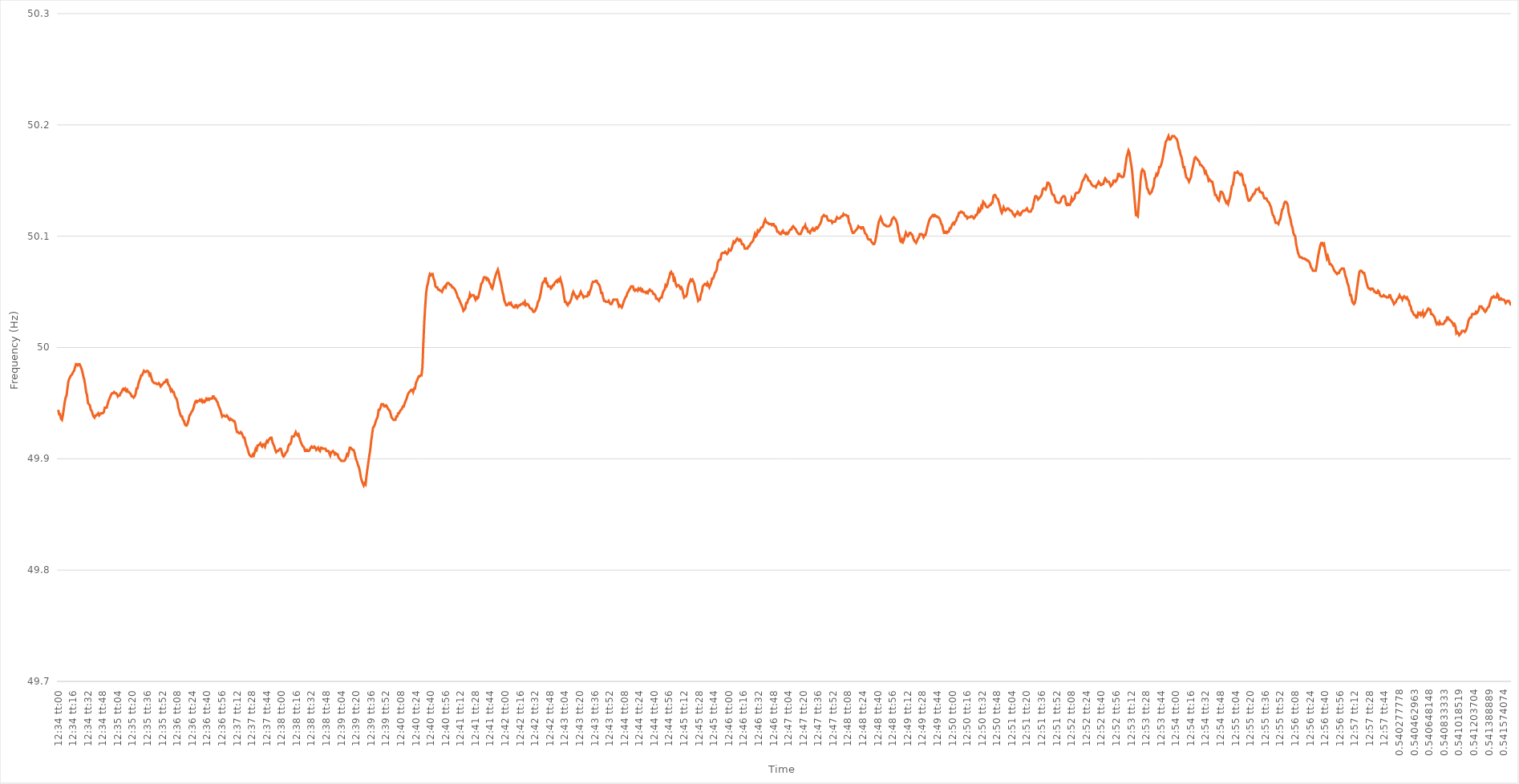
| Category | Series 0 |
|---|---|
| 0.5236111111111111 | 49.944 |
| 0.5236226851851852 | 49.94 |
| 0.5236342592592592 | 49.94 |
| 0.5236458333333334 | 49.936 |
| 0.5236574074074074 | 49.935 |
| 0.5236689814814816 | 49.939 |
| 0.5236805555555556 | 49.945 |
| 0.5236921296296296 | 49.951 |
| 0.5237037037037037 | 49.955 |
| 0.5237152777777777 | 49.957 |
| 0.5237268518518519 | 49.964 |
| 0.5237384259259259 | 49.97 |
| 0.52375 | 49.972 |
| 0.5237615740740741 | 49.974 |
| 0.5237731481481481 | 49.975 |
| 0.5237847222222222 | 49.976 |
| 0.5237962962962963 | 49.978 |
| 0.5238078703703704 | 49.979 |
| 0.5238194444444445 | 49.982 |
| 0.5238310185185185 | 49.985 |
| 0.5238425925925926 | 49.985 |
| 0.5238541666666666 | 49.984 |
| 0.5238657407407408 | 49.985 |
| 0.5238773148148148 | 49.985 |
| 0.523888888888889 | 49.983 |
| 0.523900462962963 | 49.981 |
| 0.523912037037037 | 49.978 |
| 0.5239236111111111 | 49.974 |
| 0.5239351851851851 | 49.971 |
| 0.5239467592592593 | 49.966 |
| 0.5239583333333333 | 49.96 |
| 0.5239699074074075 | 49.957 |
| 0.5239814814814815 | 49.95 |
| 0.5239930555555555 | 49.949 |
| 0.5240046296296296 | 49.948 |
| 0.5240162037037037 | 49.944 |
| 0.5240277777777778 | 49.943 |
| 0.5240393518518519 | 49.94 |
| 0.524050925925926 | 49.938 |
| 0.5240625 | 49.937 |
| 0.524074074074074 | 49.939 |
| 0.5240856481481482 | 49.939 |
| 0.5240972222222222 | 49.94 |
| 0.5241087962962964 | 49.941 |
| 0.5241203703703704 | 49.939 |
| 0.5241319444444444 | 49.94 |
| 0.5241435185185185 | 49.941 |
| 0.5241550925925925 | 49.941 |
| 0.5241666666666667 | 49.941 |
| 0.5241782407407407 | 49.942 |
| 0.5241898148148149 | 49.946 |
| 0.5242013888888889 | 49.946 |
| 0.5242129629629629 | 49.946 |
| 0.524224537037037 | 49.949 |
| 0.5242361111111111 | 49.952 |
| 0.5242476851851852 | 49.954 |
| 0.5242592592592593 | 49.956 |
| 0.5242708333333334 | 49.958 |
| 0.5242824074074074 | 49.959 |
| 0.5242939814814814 | 49.959 |
| 0.5243055555555556 | 49.96 |
| 0.5243171296296296 | 49.959 |
| 0.5243287037037038 | 49.959 |
| 0.5243402777777778 | 49.958 |
| 0.5243518518518518 | 49.956 |
| 0.5243634259259259 | 49.957 |
| 0.524375 | 49.957 |
| 0.5243865740740741 | 49.959 |
| 0.5243981481481481 | 49.96 |
| 0.5244097222222223 | 49.962 |
| 0.5244212962962963 | 49.963 |
| 0.5244328703703703 | 49.962 |
| 0.5244444444444444 | 49.963 |
| 0.5244560185185185 | 49.961 |
| 0.5244675925925926 | 49.962 |
| 0.5244791666666667 | 49.96 |
| 0.5244907407407408 | 49.96 |
| 0.5245023148148148 | 49.959 |
| 0.5245138888888888 | 49.958 |
| 0.524525462962963 | 49.956 |
| 0.524537037037037 | 49.956 |
| 0.5245486111111112 | 49.955 |
| 0.5245601851851852 | 49.956 |
| 0.5245717592592593 | 49.958 |
| 0.5245833333333333 | 49.963 |
| 0.5245949074074074 | 49.963 |
| 0.5246064814814815 | 49.967 |
| 0.5246180555555556 | 49.97 |
| 0.5246296296296297 | 49.972 |
| 0.5246412037037037 | 49.975 |
| 0.5246527777777777 | 49.975 |
| 0.5246643518518518 | 49.977 |
| 0.5246759259259259 | 49.979 |
| 0.5246875 | 49.978 |
| 0.5246990740740741 | 49.978 |
| 0.5247106481481482 | 49.979 |
| 0.5247222222222222 | 49.979 |
| 0.5247337962962962 | 49.978 |
| 0.5247453703703704 | 49.975 |
| 0.5247569444444444 | 49.976 |
| 0.5247685185185186 | 49.973 |
| 0.5247800925925926 | 49.97 |
| 0.5247916666666667 | 49.969 |
| 0.5248032407407407 | 49.968 |
| 0.5248148148148148 | 49.968 |
| 0.5248263888888889 | 49.968 |
| 0.524837962962963 | 49.967 |
| 0.5248495370370371 | 49.967 |
| 0.5248611111111111 | 49.968 |
| 0.5248726851851852 | 49.967 |
| 0.5248842592592592 | 49.965 |
| 0.5248958333333333 | 49.966 |
| 0.5249074074074074 | 49.967 |
| 0.5249189814814815 | 49.968 |
| 0.5249305555555556 | 49.969 |
| 0.5249421296296296 | 49.969 |
| 0.5249537037037036 | 49.971 |
| 0.5249652777777778 | 49.971 |
| 0.5249768518518518 | 49.967 |
| 0.524988425925926 | 49.966 |
| 0.525 | 49.964 |
| 0.5250115740740741 | 49.961 |
| 0.5250231481481481 | 49.962 |
| 0.5250347222222222 | 49.96 |
| 0.5250462962962963 | 49.96 |
| 0.5250578703703704 | 49.957 |
| 0.5250694444444445 | 49.955 |
| 0.5250810185185185 | 49.954 |
| 0.5250925925925926 | 49.951 |
| 0.5251041666666666 | 49.946 |
| 0.5251157407407407 | 49.943 |
| 0.5251273148148148 | 49.94 |
| 0.5251388888888889 | 49.938 |
| 0.525150462962963 | 49.938 |
| 0.525162037037037 | 49.935 |
| 0.525173611111111 | 49.934 |
| 0.5251851851851852 | 49.931 |
| 0.5251967592592592 | 49.93 |
| 0.5252083333333334 | 49.93 |
| 0.5252199074074074 | 49.932 |
| 0.5252314814814815 | 49.935 |
| 0.5252430555555555 | 49.939 |
| 0.5252546296296297 | 49.94 |
| 0.5252662037037037 | 49.942 |
| 0.5252777777777778 | 49.943 |
| 0.5252893518518519 | 49.945 |
| 0.5253009259259259 | 49.948 |
| 0.5253125 | 49.951 |
| 0.5253240740740741 | 49.952 |
| 0.5253356481481481 | 49.951 |
| 0.5253472222222222 | 49.952 |
| 0.5253587962962963 | 49.952 |
| 0.5253703703703704 | 49.953 |
| 0.5253819444444444 | 49.952 |
| 0.5253935185185185 | 49.953 |
| 0.5254050925925926 | 49.951 |
| 0.5254166666666666 | 49.952 |
| 0.5254282407407408 | 49.951 |
| 0.5254398148148148 | 49.952 |
| 0.5254513888888889 | 49.954 |
| 0.5254629629629629 | 49.953 |
| 0.5254745370370371 | 49.954 |
| 0.5254861111111111 | 49.953 |
| 0.5254976851851852 | 49.954 |
| 0.5255092592592593 | 49.954 |
| 0.5255208333333333 | 49.954 |
| 0.5255324074074074 | 49.956 |
| 0.5255439814814815 | 49.956 |
| 0.5255555555555556 | 49.954 |
| 0.5255671296296297 | 49.954 |
| 0.5255787037037037 | 49.952 |
| 0.5255902777777778 | 49.951 |
| 0.5256018518518518 | 49.948 |
| 0.5256134259259259 | 49.946 |
| 0.525625 | 49.944 |
| 0.525636574074074 | 49.941 |
| 0.5256481481481482 | 49.938 |
| 0.5256597222222222 | 49.939 |
| 0.5256712962962963 | 49.939 |
| 0.5256828703703703 | 49.938 |
| 0.5256944444444445 | 49.938 |
| 0.5257060185185185 | 49.939 |
| 0.5257175925925927 | 49.938 |
| 0.5257291666666667 | 49.936 |
| 0.5257407407407407 | 49.935 |
| 0.5257523148148148 | 49.936 |
| 0.5257638888888889 | 49.935 |
| 0.525775462962963 | 49.935 |
| 0.5257870370370371 | 49.934 |
| 0.5257986111111111 | 49.934 |
| 0.5258101851851852 | 49.932 |
| 0.5258217592592592 | 49.927 |
| 0.5258333333333333 | 49.924 |
| 0.5258449074074074 | 49.924 |
| 0.5258564814814815 | 49.923 |
| 0.5258680555555556 | 49.923 |
| 0.5258796296296296 | 49.924 |
| 0.5258912037037037 | 49.923 |
| 0.5259027777777777 | 49.921 |
| 0.5259143518518519 | 49.919 |
| 0.5259259259259259 | 49.919 |
| 0.5259375000000001 | 49.915 |
| 0.5259490740740741 | 49.912 |
| 0.5259606481481481 | 49.91 |
| 0.5259722222222222 | 49.907 |
| 0.5259837962962963 | 49.904 |
| 0.5259953703703704 | 49.903 |
| 0.5260069444444445 | 49.902 |
| 0.5260185185185186 | 49.902 |
| 0.5260300925925926 | 49.904 |
| 0.5260416666666666 | 49.903 |
| 0.5260532407407407 | 49.906 |
| 0.5260648148148148 | 49.909 |
| 0.5260763888888889 | 49.908 |
| 0.526087962962963 | 49.912 |
| 0.526099537037037 | 49.912 |
| 0.5261111111111111 | 49.913 |
| 0.5261226851851851 | 49.914 |
| 0.5261342592592593 | 49.912 |
| 0.5261458333333333 | 49.911 |
| 0.5261574074074075 | 49.913 |
| 0.5261689814814815 | 49.913 |
| 0.5261805555555555 | 49.911 |
| 0.5261921296296296 | 49.914 |
| 0.5262037037037037 | 49.916 |
| 0.5262152777777778 | 49.915 |
| 0.5262268518518519 | 49.917 |
| 0.526238425925926 | 49.918 |
| 0.52625 | 49.919 |
| 0.526261574074074 | 49.919 |
| 0.5262731481481482 | 49.915 |
| 0.5262847222222222 | 49.913 |
| 0.5262962962962963 | 49.911 |
| 0.5263078703703704 | 49.908 |
| 0.5263194444444445 | 49.906 |
| 0.5263310185185185 | 49.907 |
| 0.5263425925925925 | 49.907 |
| 0.5263541666666667 | 49.908 |
| 0.5263657407407407 | 49.909 |
| 0.5263773148148149 | 49.909 |
| 0.5263888888888889 | 49.906 |
| 0.526400462962963 | 49.903 |
| 0.526412037037037 | 49.902 |
| 0.5264236111111111 | 49.903 |
| 0.5264351851851852 | 49.905 |
| 0.5264467592592593 | 49.906 |
| 0.5264583333333334 | 49.907 |
| 0.5264699074074074 | 49.911 |
| 0.5264814814814814 | 49.913 |
| 0.5264930555555556 | 49.913 |
| 0.5265046296296296 | 49.915 |
| 0.5265162037037037 | 49.92 |
| 0.5265277777777778 | 49.92 |
| 0.5265393518518519 | 49.92 |
| 0.5265509259259259 | 49.922 |
| 0.5265624999999999 | 49.924 |
| 0.5265740740740741 | 49.922 |
| 0.5265856481481481 | 49.921 |
| 0.5265972222222223 | 49.922 |
| 0.5266087962962963 | 49.919 |
| 0.5266203703703703 | 49.916 |
| 0.5266319444444444 | 49.914 |
| 0.5266435185185185 | 49.912 |
| 0.5266550925925926 | 49.911 |
| 0.5266666666666667 | 49.91 |
| 0.5266782407407408 | 49.907 |
| 0.5266898148148148 | 49.907 |
| 0.5267013888888888 | 49.908 |
| 0.526712962962963 | 49.907 |
| 0.526724537037037 | 49.907 |
| 0.5267361111111112 | 49.908 |
| 0.5267476851851852 | 49.91 |
| 0.5267592592592593 | 49.911 |
| 0.5267708333333333 | 49.91 |
| 0.5267824074074073 | 49.91 |
| 0.5267939814814815 | 49.911 |
| 0.5268055555555555 | 49.91 |
| 0.5268171296296297 | 49.908 |
| 0.5268287037037037 | 49.909 |
| 0.5268402777777778 | 49.91 |
| 0.5268518518518518 | 49.908 |
| 0.5268634259259259 | 49.907 |
| 0.526875 | 49.91 |
| 0.5268865740740741 | 49.91 |
| 0.5268981481481482 | 49.909 |
| 0.5269097222222222 | 49.909 |
| 0.5269212962962962 | 49.909 |
| 0.5269328703703704 | 49.909 |
| 0.5269444444444444 | 49.907 |
| 0.5269560185185186 | 49.907 |
| 0.5269675925925926 | 49.907 |
| 0.5269791666666667 | 49.905 |
| 0.5269907407407407 | 49.903 |
| 0.5270023148148147 | 49.906 |
| 0.5270138888888889 | 49.906 |
| 0.5270254629629629 | 49.907 |
| 0.5270370370370371 | 49.906 |
| 0.5270486111111111 | 49.904 |
| 0.5270601851851852 | 49.905 |
| 0.5270717592592592 | 49.904 |
| 0.5270833333333333 | 49.904 |
| 0.5270949074074074 | 49.901 |
| 0.5271064814814815 | 49.9 |
| 0.5271180555555556 | 49.899 |
| 0.5271296296296296 | 49.898 |
| 0.5271412037037037 | 49.898 |
| 0.5271527777777778 | 49.898 |
| 0.5271643518518518 | 49.898 |
| 0.527175925925926 | 49.899 |
| 0.5271875 | 49.901 |
| 0.5271990740740741 | 49.904 |
| 0.5272106481481481 | 49.903 |
| 0.5272222222222223 | 49.906 |
| 0.5272337962962963 | 49.91 |
| 0.5272453703703703 | 49.91 |
| 0.5272569444444445 | 49.909 |
| 0.5272685185185185 | 49.908 |
| 0.5272800925925926 | 49.908 |
| 0.5272916666666666 | 49.906 |
| 0.5273032407407408 | 49.902 |
| 0.5273148148148148 | 49.899 |
| 0.5273263888888889 | 49.897 |
| 0.527337962962963 | 49.894 |
| 0.527349537037037 | 49.892 |
| 0.5273611111111111 | 49.888 |
| 0.5273726851851852 | 49.883 |
| 0.5273842592592592 | 49.88 |
| 0.5273958333333334 | 49.878 |
| 0.5274074074074074 | 49.876 |
| 0.5274189814814815 | 49.878 |
| 0.5274305555555555 | 49.877 |
| 0.5274421296296297 | 49.885 |
| 0.5274537037037037 | 49.891 |
| 0.5274652777777777 | 49.897 |
| 0.5274768518518519 | 49.903 |
| 0.5274884259259259 | 49.908 |
| 0.5275 | 49.916 |
| 0.527511574074074 | 49.922 |
| 0.5275231481481482 | 49.928 |
| 0.5275347222222222 | 49.929 |
| 0.5275462962962963 | 49.931 |
| 0.5275578703703704 | 49.934 |
| 0.5275694444444444 | 49.936 |
| 0.5275810185185185 | 49.938 |
| 0.5275925925925926 | 49.944 |
| 0.5276041666666667 | 49.944 |
| 0.5276157407407408 | 49.946 |
| 0.5276273148148148 | 49.949 |
| 0.5276388888888889 | 49.949 |
| 0.5276504629629629 | 49.949 |
| 0.5276620370370371 | 49.947 |
| 0.5276736111111111 | 49.947 |
| 0.5276851851851853 | 49.948 |
| 0.5276967592592593 | 49.947 |
| 0.5277083333333333 | 49.945 |
| 0.5277199074074074 | 49.944 |
| 0.5277314814814814 | 49.943 |
| 0.5277430555555556 | 49.94 |
| 0.5277546296296296 | 49.937 |
| 0.5277662037037038 | 49.936 |
| 0.5277777777777778 | 49.935 |
| 0.5277893518518518 | 49.935 |
| 0.5278009259259259 | 49.935 |
| 0.5278125 | 49.938 |
| 0.5278240740740741 | 49.938 |
| 0.5278356481481482 | 49.941 |
| 0.5278472222222222 | 49.941 |
| 0.5278587962962963 | 49.943 |
| 0.5278703703703703 | 49.944 |
| 0.5278819444444445 | 49.945 |
| 0.5278935185185185 | 49.947 |
| 0.5279050925925927 | 49.947 |
| 0.5279166666666667 | 49.95 |
| 0.5279282407407407 | 49.952 |
| 0.5279398148148148 | 49.954 |
| 0.5279513888888888 | 49.957 |
| 0.527962962962963 | 49.959 |
| 0.527974537037037 | 49.96 |
| 0.5279861111111112 | 49.961 |
| 0.5279976851851852 | 49.962 |
| 0.5280092592592592 | 49.962 |
| 0.5280208333333333 | 49.96 |
| 0.5280324074074074 | 49.963 |
| 0.5280439814814815 | 49.963 |
| 0.5280555555555556 | 49.968 |
| 0.5280671296296297 | 49.97 |
| 0.5280787037037037 | 49.972 |
| 0.5280902777777777 | 49.974 |
| 0.5281018518518519 | 49.974 |
| 0.5281134259259259 | 49.975 |
| 0.5281250000000001 | 49.975 |
| 0.5281365740740741 | 49.982 |
| 0.5281481481481481 | 50.004 |
| 0.5281597222222222 | 50.023 |
| 0.5281712962962963 | 50.037 |
| 0.5281828703703704 | 50.049 |
| 0.5281944444444444 | 50.055 |
| 0.5282060185185186 | 50.058 |
| 0.5282175925925926 | 50.063 |
| 0.5282291666666666 | 50.066 |
| 0.5282407407407407 | 50.065 |
| 0.5282523148148148 | 50.066 |
| 0.5282638888888889 | 50.066 |
| 0.528275462962963 | 50.062 |
| 0.528287037037037 | 50.06 |
| 0.5282986111111111 | 50.055 |
| 0.5283101851851851 | 50.054 |
| 0.5283217592592593 | 50.054 |
| 0.5283333333333333 | 50.052 |
| 0.5283449074074075 | 50.052 |
| 0.5283564814814815 | 50.051 |
| 0.5283680555555555 | 50.051 |
| 0.5283796296296296 | 50.05 |
| 0.5283912037037037 | 50.052 |
| 0.5284027777777778 | 50.054 |
| 0.5284143518518518 | 50.055 |
| 0.528425925925926 | 50.054 |
| 0.5284375 | 50.057 |
| 0.528449074074074 | 50.058 |
| 0.5284606481481481 | 50.058 |
| 0.5284722222222222 | 50.057 |
| 0.5284837962962963 | 50.056 |
| 0.5284953703703704 | 50.056 |
| 0.5285069444444445 | 50.054 |
| 0.5285185185185185 | 50.054 |
| 0.5285300925925925 | 50.053 |
| 0.5285416666666667 | 50.052 |
| 0.5285532407407407 | 50.05 |
| 0.5285648148148149 | 50.048 |
| 0.5285763888888889 | 50.045 |
| 0.528587962962963 | 50.044 |
| 0.528599537037037 | 50.042 |
| 0.5286111111111111 | 50.04 |
| 0.5286226851851852 | 50.038 |
| 0.5286342592592593 | 50.036 |
| 0.5286458333333334 | 50.033 |
| 0.5286574074074074 | 50.034 |
| 0.5286689814814814 | 50.035 |
| 0.5286805555555555 | 50.04 |
| 0.5286921296296296 | 50.04 |
| 0.5287037037037037 | 50.043 |
| 0.5287152777777778 | 50.044 |
| 0.5287268518518519 | 50.048 |
| 0.5287384259259259 | 50.046 |
| 0.5287499999999999 | 50.047 |
| 0.5287615740740741 | 50.047 |
| 0.5287731481481481 | 50.047 |
| 0.5287847222222223 | 50.045 |
| 0.5287962962962963 | 50.043 |
| 0.5288078703703704 | 50.045 |
| 0.5288194444444444 | 50.044 |
| 0.5288310185185185 | 50.045 |
| 0.5288425925925926 | 50.049 |
| 0.5288541666666667 | 50.052 |
| 0.5288657407407408 | 50.057 |
| 0.5288773148148148 | 50.058 |
| 0.5288888888888889 | 50.06 |
| 0.5289004629629629 | 50.063 |
| 0.528912037037037 | 50.063 |
| 0.5289236111111111 | 50.063 |
| 0.5289351851851852 | 50.061 |
| 0.5289467592592593 | 50.062 |
| 0.5289583333333333 | 50.061 |
| 0.5289699074074073 | 50.058 |
| 0.5289814814814815 | 50.057 |
| 0.5289930555555555 | 50.054 |
| 0.5290046296296297 | 50.053 |
| 0.5290162037037037 | 50.056 |
| 0.5290277777777778 | 50.06 |
| 0.5290393518518518 | 50.063 |
| 0.529050925925926 | 50.066 |
| 0.5290625 | 50.068 |
| 0.5290740740740741 | 50.07 |
| 0.5290856481481482 | 50.067 |
| 0.5290972222222222 | 50.062 |
| 0.5291087962962963 | 50.059 |
| 0.5291203703703703 | 50.055 |
| 0.5291319444444444 | 50.05 |
| 0.5291435185185185 | 50.047 |
| 0.5291550925925926 | 50.042 |
| 0.5291666666666667 | 50.04 |
| 0.5291782407407407 | 50.038 |
| 0.5291898148148148 | 50.038 |
| 0.5292013888888889 | 50.039 |
| 0.5292129629629629 | 50.04 |
| 0.5292245370370371 | 50.039 |
| 0.5292361111111111 | 50.04 |
| 0.5292476851851852 | 50.038 |
| 0.5292592592592592 | 50.037 |
| 0.5292708333333334 | 50.036 |
| 0.5292824074074074 | 50.036 |
| 0.5292939814814815 | 50.038 |
| 0.5293055555555556 | 50.038 |
| 0.5293171296296296 | 50.036 |
| 0.5293287037037037 | 50.037 |
| 0.5293402777777778 | 50.038 |
| 0.5293518518518519 | 50.038 |
| 0.5293634259259259 | 50.039 |
| 0.529375 | 50.039 |
| 0.5293865740740741 | 50.04 |
| 0.5293981481481481 | 50.039 |
| 0.5294097222222222 | 50.041 |
| 0.5294212962962963 | 50.038 |
| 0.5294328703703703 | 50.039 |
| 0.5294444444444445 | 50.039 |
| 0.5294560185185185 | 50.038 |
| 0.5294675925925926 | 50.036 |
| 0.5294791666666666 | 50.035 |
| 0.5294907407407408 | 50.035 |
| 0.5295023148148148 | 50.034 |
| 0.529513888888889 | 50.032 |
| 0.529525462962963 | 50.032 |
| 0.529537037037037 | 50.033 |
| 0.5295486111111111 | 50.035 |
| 0.5295601851851852 | 50.037 |
| 0.5295717592592593 | 50.041 |
| 0.5295833333333334 | 50.042 |
| 0.5295949074074074 | 50.045 |
| 0.5296064814814815 | 50.049 |
| 0.5296180555555555 | 50.054 |
| 0.5296296296296296 | 50.058 |
| 0.5296412037037037 | 50.059 |
| 0.5296527777777778 | 50.06 |
| 0.5296643518518519 | 50.063 |
| 0.5296759259259259 | 50.058 |
| 0.5296875 | 50.058 |
| 0.529699074074074 | 50.055 |
| 0.5297106481481482 | 50.055 |
| 0.5297222222222222 | 50.055 |
| 0.5297337962962964 | 50.053 |
| 0.5297453703703704 | 50.054 |
| 0.5297569444444444 | 50.056 |
| 0.5297685185185185 | 50.056 |
| 0.5297800925925926 | 50.058 |
| 0.5297916666666667 | 50.059 |
| 0.5298032407407408 | 50.06 |
| 0.5298148148148148 | 50.059 |
| 0.5298263888888889 | 50.061 |
| 0.5298379629629629 | 50.06 |
| 0.529849537037037 | 50.062 |
| 0.5298611111111111 | 50.059 |
| 0.5298726851851852 | 50.056 |
| 0.5298842592592593 | 50.052 |
| 0.5298958333333333 | 50.046 |
| 0.5299074074074074 | 50.041 |
| 0.5299189814814814 | 50.041 |
| 0.5299305555555556 | 50.039 |
| 0.5299421296296296 | 50.038 |
| 0.5299537037037038 | 50.04 |
| 0.5299652777777778 | 50.04 |
| 0.5299768518518518 | 50.042 |
| 0.5299884259259259 | 50.044 |
| 0.53 | 50.048 |
| 0.5300115740740741 | 50.05 |
| 0.5300231481481482 | 50.048 |
| 0.5300347222222223 | 50.047 |
| 0.5300462962962963 | 50.045 |
| 0.5300578703703703 | 50.044 |
| 0.5300694444444444 | 50.046 |
| 0.5300810185185185 | 50.046 |
| 0.5300925925925926 | 50.048 |
| 0.5301041666666667 | 50.05 |
| 0.5301157407407407 | 50.048 |
| 0.5301273148148148 | 50.047 |
| 0.5301388888888888 | 50.045 |
| 0.530150462962963 | 50.046 |
| 0.530162037037037 | 50.046 |
| 0.5301736111111112 | 50.046 |
| 0.5301851851851852 | 50.046 |
| 0.5301967592592592 | 50.049 |
| 0.5302083333333333 | 50.048 |
| 0.5302199074074074 | 50.051 |
| 0.5302314814814815 | 50.053 |
| 0.5302430555555556 | 50.057 |
| 0.5302546296296297 | 50.059 |
| 0.5302662037037037 | 50.059 |
| 0.5302777777777777 | 50.059 |
| 0.5302893518518519 | 50.06 |
| 0.5303009259259259 | 50.06 |
| 0.5303125 | 50.058 |
| 0.5303240740740741 | 50.057 |
| 0.5303356481481482 | 50.056 |
| 0.5303472222222222 | 50.053 |
| 0.5303587962962962 | 50.049 |
| 0.5303703703703704 | 50.049 |
| 0.5303819444444444 | 50.045 |
| 0.5303935185185186 | 50.042 |
| 0.5304050925925926 | 50.042 |
| 0.5304166666666666 | 50.041 |
| 0.5304282407407407 | 50.041 |
| 0.5304398148148148 | 50.041 |
| 0.5304513888888889 | 50.042 |
| 0.530462962962963 | 50.04 |
| 0.5304745370370371 | 50.039 |
| 0.5304861111111111 | 50.039 |
| 0.5304976851851851 | 50.041 |
| 0.5305092592592593 | 50.043 |
| 0.5305208333333333 | 50.043 |
| 0.5305324074074075 | 50.043 |
| 0.5305439814814815 | 50.043 |
| 0.5305555555555556 | 50.043 |
| 0.5305671296296296 | 50.04 |
| 0.5305787037037036 | 50.037 |
| 0.5305902777777778 | 50.038 |
| 0.5306018518518518 | 50.037 |
| 0.530613425925926 | 50.036 |
| 0.530625 | 50.038 |
| 0.530636574074074 | 50.041 |
| 0.5306481481481481 | 50.043 |
| 0.5306597222222222 | 50.045 |
| 0.5306712962962963 | 50.046 |
| 0.5306828703703704 | 50.049 |
| 0.5306944444444445 | 50.05 |
| 0.5307060185185185 | 50.052 |
| 0.5307175925925925 | 50.053 |
| 0.5307291666666667 | 50.055 |
| 0.5307407407407407 | 50.055 |
| 0.5307523148148149 | 50.055 |
| 0.5307638888888889 | 50.052 |
| 0.530775462962963 | 50.051 |
| 0.530787037037037 | 50.052 |
| 0.530798611111111 | 50.052 |
| 0.5308101851851852 | 50.051 |
| 0.5308217592592592 | 50.053 |
| 0.5308333333333334 | 50.052 |
| 0.5308449074074074 | 50.053 |
| 0.5308564814814815 | 50.051 |
| 0.5308680555555555 | 50.052 |
| 0.5308796296296296 | 50.05 |
| 0.5308912037037037 | 50.05 |
| 0.5309027777777778 | 50.05 |
| 0.5309143518518519 | 50.049 |
| 0.5309259259259259 | 50.05 |
| 0.5309375 | 50.049 |
| 0.5309490740740741 | 50.051 |
| 0.5309606481481481 | 50.052 |
| 0.5309722222222223 | 50.051 |
| 0.5309837962962963 | 50.051 |
| 0.5309953703703704 | 50.05 |
| 0.5310069444444444 | 50.048 |
| 0.5310185185185184 | 50.048 |
| 0.5310300925925926 | 50.047 |
| 0.5310416666666666 | 50.044 |
| 0.5310532407407408 | 50.044 |
| 0.5310648148148148 | 50.043 |
| 0.5310763888888889 | 50.042 |
| 0.5310879629629629 | 50.044 |
| 0.531099537037037 | 50.045 |
| 0.5311111111111111 | 50.045 |
| 0.5311226851851852 | 50.049 |
| 0.5311342592592593 | 50.051 |
| 0.5311458333333333 | 50.052 |
| 0.5311574074074074 | 50.056 |
| 0.5311689814814815 | 50.055 |
| 0.5311805555555555 | 50.057 |
| 0.5311921296296297 | 50.061 |
| 0.5312037037037037 | 50.063 |
| 0.5312152777777778 | 50.067 |
| 0.5312268518518518 | 50.068 |
| 0.531238425925926 | 50.066 |
| 0.53125 | 50.066 |
| 0.531261574074074 | 50.059 |
| 0.5312731481481482 | 50.061 |
| 0.5312847222222222 | 50.057 |
| 0.5312962962962963 | 50.055 |
| 0.5313078703703703 | 50.056 |
| 0.5313194444444445 | 50.056 |
| 0.5313310185185185 | 50.055 |
| 0.5313425925925926 | 50.053 |
| 0.5313541666666667 | 50.054 |
| 0.5313657407407407 | 50.052 |
| 0.5313773148148148 | 50.048 |
| 0.5313888888888889 | 50.045 |
| 0.531400462962963 | 50.046 |
| 0.5314120370370371 | 50.046 |
| 0.5314236111111111 | 50.048 |
| 0.5314351851851852 | 50.054 |
| 0.5314467592592592 | 50.057 |
| 0.5314583333333334 | 50.059 |
| 0.5314699074074074 | 50.061 |
| 0.5314814814814816 | 50.06 |
| 0.5314930555555556 | 50.061 |
| 0.5315046296296296 | 50.059 |
| 0.5315162037037037 | 50.057 |
| 0.5315277777777777 | 50.052 |
| 0.5315393518518519 | 50.049 |
| 0.5315509259259259 | 50.046 |
| 0.5315625 | 50.042 |
| 0.5315740740740741 | 50.043 |
| 0.5315856481481481 | 50.043 |
| 0.5315972222222222 | 50.048 |
| 0.5316087962962963 | 50.05 |
| 0.5316203703703704 | 50.055 |
| 0.5316319444444445 | 50.056 |
| 0.5316435185185185 | 50.057 |
| 0.5316550925925926 | 50.057 |
| 0.5316666666666666 | 50.056 |
| 0.5316782407407408 | 50.058 |
| 0.5316898148148148 | 50.056 |
| 0.531701388888889 | 50.054 |
| 0.531712962962963 | 50.056 |
| 0.531724537037037 | 50.058 |
| 0.5317361111111111 | 50.062 |
| 0.5317476851851851 | 50.062 |
| 0.5317592592592593 | 50.064 |
| 0.5317708333333333 | 50.067 |
| 0.5317824074074075 | 50.068 |
| 0.5317939814814815 | 50.07 |
| 0.5318055555555555 | 50.076 |
| 0.5318171296296296 | 50.078 |
| 0.5318287037037037 | 50.079 |
| 0.5318402777777778 | 50.079 |
| 0.5318518518518519 | 50.084 |
| 0.531863425925926 | 50.085 |
| 0.531875 | 50.085 |
| 0.531886574074074 | 50.085 |
| 0.5318981481481482 | 50.086 |
| 0.5319097222222222 | 50.085 |
| 0.5319212962962964 | 50.084 |
| 0.5319328703703704 | 50.085 |
| 0.5319444444444444 | 50.088 |
| 0.5319560185185185 | 50.087 |
| 0.5319675925925925 | 50.087 |
| 0.5319791666666667 | 50.089 |
| 0.5319907407407407 | 50.092 |
| 0.5320023148148149 | 50.095 |
| 0.5320138888888889 | 50.094 |
| 0.5320254629629629 | 50.095 |
| 0.532037037037037 | 50.097 |
| 0.5320486111111111 | 50.098 |
| 0.5320601851851852 | 50.097 |
| 0.5320717592592593 | 50.096 |
| 0.5320833333333334 | 50.097 |
| 0.5320949074074074 | 50.096 |
| 0.5321064814814814 | 50.093 |
| 0.5321180555555556 | 50.093 |
| 0.5321296296296296 | 50.092 |
| 0.5321412037037038 | 50.089 |
| 0.5321527777777778 | 50.089 |
| 0.5321643518518518 | 50.089 |
| 0.5321759259259259 | 50.089 |
| 0.5321875 | 50.091 |
| 0.5321990740740741 | 50.091 |
| 0.5322106481481481 | 50.093 |
| 0.5322222222222223 | 50.094 |
| 0.5322337962962963 | 50.095 |
| 0.5322453703703703 | 50.096 |
| 0.5322569444444444 | 50.099 |
| 0.5322685185185185 | 50.102 |
| 0.5322800925925926 | 50.1 |
| 0.5322916666666667 | 50.101 |
| 0.5323032407407408 | 50.105 |
| 0.5323148148148148 | 50.104 |
| 0.5323263888888888 | 50.105 |
| 0.532337962962963 | 50.107 |
| 0.532349537037037 | 50.108 |
| 0.5323611111111112 | 50.108 |
| 0.5323726851851852 | 50.11 |
| 0.5323842592592593 | 50.113 |
| 0.5323958333333333 | 50.115 |
| 0.5324074074074074 | 50.113 |
| 0.5324189814814815 | 50.112 |
| 0.5324305555555556 | 50.112 |
| 0.5324421296296297 | 50.111 |
| 0.5324537037037037 | 50.111 |
| 0.5324652777777777 | 50.111 |
| 0.5324768518518518 | 50.11 |
| 0.5324884259259259 | 50.111 |
| 0.5325 | 50.111 |
| 0.5325115740740741 | 50.109 |
| 0.5325231481481482 | 50.109 |
| 0.5325347222222222 | 50.107 |
| 0.5325462962962962 | 50.104 |
| 0.5325578703703704 | 50.104 |
| 0.5325694444444444 | 50.103 |
| 0.5325810185185186 | 50.102 |
| 0.5325925925925926 | 50.102 |
| 0.5326041666666667 | 50.104 |
| 0.5326157407407407 | 50.105 |
| 0.5326273148148148 | 50.103 |
| 0.5326388888888889 | 50.103 |
| 0.532650462962963 | 50.102 |
| 0.5326620370370371 | 50.103 |
| 0.5326736111111111 | 50.102 |
| 0.5326851851851852 | 50.103 |
| 0.5326967592592592 | 50.105 |
| 0.5327083333333333 | 50.106 |
| 0.5327199074074074 | 50.106 |
| 0.5327314814814815 | 50.108 |
| 0.5327430555555556 | 50.109 |
| 0.5327546296296296 | 50.108 |
| 0.5327662037037036 | 50.107 |
| 0.5327777777777778 | 50.106 |
| 0.5327893518518518 | 50.104 |
| 0.532800925925926 | 50.103 |
| 0.5328125 | 50.102 |
| 0.5328240740740741 | 50.102 |
| 0.5328356481481481 | 50.102 |
| 0.5328472222222222 | 50.104 |
| 0.5328587962962963 | 50.106 |
| 0.5328703703703704 | 50.108 |
| 0.5328819444444445 | 50.108 |
| 0.5328935185185185 | 50.11 |
| 0.5329050925925926 | 50.107 |
| 0.5329166666666666 | 50.107 |
| 0.5329282407407407 | 50.104 |
| 0.5329398148148148 | 50.104 |
| 0.5329513888888889 | 50.103 |
| 0.532962962962963 | 50.105 |
| 0.532974537037037 | 50.106 |
| 0.532986111111111 | 50.107 |
| 0.5329976851851852 | 50.105 |
| 0.5330092592592592 | 50.105 |
| 0.5330208333333334 | 50.107 |
| 0.5330324074074074 | 50.108 |
| 0.5330439814814815 | 50.107 |
| 0.5330555555555555 | 50.108 |
| 0.5330671296296297 | 50.11 |
| 0.5330787037037037 | 50.111 |
| 0.5330902777777778 | 50.113 |
| 0.5331018518518519 | 50.117 |
| 0.5331134259259259 | 50.118 |
| 0.533125 | 50.119 |
| 0.5331365740740741 | 50.118 |
| 0.5331481481481481 | 50.118 |
| 0.5331597222222222 | 50.118 |
| 0.5331712962962963 | 50.115 |
| 0.5331828703703704 | 50.114 |
| 0.5331944444444444 | 50.114 |
| 0.5332060185185185 | 50.114 |
| 0.5332175925925926 | 50.114 |
| 0.5332291666666666 | 50.112 |
| 0.5332407407407408 | 50.113 |
| 0.5332523148148148 | 50.113 |
| 0.5332638888888889 | 50.113 |
| 0.5332754629629629 | 50.115 |
| 0.5332870370370371 | 50.117 |
| 0.5332986111111111 | 50.116 |
| 0.5333101851851852 | 50.116 |
| 0.5333217592592593 | 50.116 |
| 0.5333333333333333 | 50.117 |
| 0.5333449074074074 | 50.118 |
| 0.5333564814814815 | 50.118 |
| 0.5333680555555556 | 50.12 |
| 0.5333796296296297 | 50.119 |
| 0.5333912037037037 | 50.119 |
| 0.5334027777777778 | 50.119 |
| 0.5334143518518518 | 50.118 |
| 0.5334259259259259 | 50.118 |
| 0.5334375 | 50.112 |
| 0.533449074074074 | 50.111 |
| 0.5334606481481482 | 50.108 |
| 0.5334722222222222 | 50.105 |
| 0.5334837962962963 | 50.103 |
| 0.5334953703703703 | 50.103 |
| 0.5335069444444445 | 50.104 |
| 0.5335185185185185 | 50.105 |
| 0.5335300925925927 | 50.106 |
| 0.5335416666666667 | 50.107 |
| 0.5335532407407407 | 50.109 |
| 0.5335648148148148 | 50.108 |
| 0.5335763888888889 | 50.108 |
| 0.533587962962963 | 50.107 |
| 0.5335995370370371 | 50.108 |
| 0.5336111111111111 | 50.108 |
| 0.5336226851851852 | 50.106 |
| 0.5336342592592592 | 50.103 |
| 0.5336458333333333 | 50.102 |
| 0.5336574074074074 | 50.101 |
| 0.5336689814814815 | 50.098 |
| 0.5336805555555556 | 50.097 |
| 0.5336921296296296 | 50.097 |
| 0.5337037037037037 | 50.097 |
| 0.5337152777777777 | 50.095 |
| 0.5337268518518519 | 50.094 |
| 0.5337384259259259 | 50.093 |
| 0.5337500000000001 | 50.093 |
| 0.5337615740740741 | 50.095 |
| 0.5337731481481481 | 50.099 |
| 0.5337847222222222 | 50.104 |
| 0.5337962962962963 | 50.109 |
| 0.5338078703703704 | 50.113 |
| 0.5338194444444445 | 50.115 |
| 0.5338310185185186 | 50.117 |
| 0.5338425925925926 | 50.115 |
| 0.5338541666666666 | 50.112 |
| 0.5338657407407407 | 50.111 |
| 0.5338773148148148 | 50.11 |
| 0.5338888888888889 | 50.11 |
| 0.533900462962963 | 50.109 |
| 0.533912037037037 | 50.109 |
| 0.5339236111111111 | 50.109 |
| 0.5339351851851851 | 50.109 |
| 0.5339467592592593 | 50.11 |
| 0.5339583333333333 | 50.111 |
| 0.5339699074074075 | 50.115 |
| 0.5339814814814815 | 50.116 |
| 0.5339930555555555 | 50.117 |
| 0.5340046296296296 | 50.116 |
| 0.5340162037037037 | 50.115 |
| 0.5340277777777778 | 50.113 |
| 0.5340393518518519 | 50.11 |
| 0.534050925925926 | 50.104 |
| 0.5340625 | 50.101 |
| 0.534074074074074 | 50.096 |
| 0.5340856481481482 | 50.095 |
| 0.5340972222222222 | 50.097 |
| 0.5341087962962963 | 50.095 |
| 0.5341203703703704 | 50.097 |
| 0.5341319444444445 | 50.1 |
| 0.5341435185185185 | 50.103 |
| 0.5341550925925925 | 50.101 |
| 0.5341666666666667 | 50.1 |
| 0.5341782407407407 | 50.101 |
| 0.5341898148148149 | 50.103 |
| 0.5342013888888889 | 50.103 |
| 0.534212962962963 | 50.102 |
| 0.534224537037037 | 50.101 |
| 0.5342361111111111 | 50.098 |
| 0.5342476851851852 | 50.096 |
| 0.5342592592592593 | 50.095 |
| 0.5342708333333334 | 50.094 |
| 0.5342824074074074 | 50.096 |
| 0.5342939814814814 | 50.098 |
| 0.5343055555555556 | 50.099 |
| 0.5343171296296296 | 50.102 |
| 0.5343287037037037 | 50.102 |
| 0.5343402777777778 | 50.102 |
| 0.5343518518518519 | 50.101 |
| 0.5343634259259259 | 50.099 |
| 0.5343749999999999 | 50.101 |
| 0.5343865740740741 | 50.101 |
| 0.5343981481481481 | 50.104 |
| 0.5344097222222223 | 50.108 |
| 0.5344212962962963 | 50.111 |
| 0.5344328703703703 | 50.114 |
| 0.5344444444444444 | 50.116 |
| 0.5344560185185185 | 50.117 |
| 0.5344675925925926 | 50.118 |
| 0.5344791666666667 | 50.119 |
| 0.5344907407407408 | 50.118 |
| 0.5345023148148148 | 50.119 |
| 0.5345138888888888 | 50.118 |
| 0.534525462962963 | 50.118 |
| 0.534537037037037 | 50.117 |
| 0.5345486111111112 | 50.117 |
| 0.5345601851851852 | 50.116 |
| 0.5345717592592593 | 50.114 |
| 0.5345833333333333 | 50.111 |
| 0.5345949074074073 | 50.11 |
| 0.5346064814814815 | 50.106 |
| 0.5346180555555555 | 50.103 |
| 0.5346296296296297 | 50.103 |
| 0.5346412037037037 | 50.104 |
| 0.5346527777777778 | 50.103 |
| 0.5346643518518518 | 50.104 |
| 0.5346759259259259 | 50.104 |
| 0.5346875 | 50.107 |
| 0.5346990740740741 | 50.107 |
| 0.5347106481481482 | 50.109 |
| 0.5347222222222222 | 50.111 |
| 0.5347337962962962 | 50.112 |
| 0.5347453703703704 | 50.111 |
| 0.5347569444444444 | 50.113 |
| 0.5347685185185186 | 50.114 |
| 0.5347800925925926 | 50.117 |
| 0.5347916666666667 | 50.118 |
| 0.5348032407407407 | 50.121 |
| 0.5348148148148147 | 50.121 |
| 0.5348263888888889 | 50.122 |
| 0.5348379629629629 | 50.122 |
| 0.5348495370370371 | 50.121 |
| 0.5348611111111111 | 50.121 |
| 0.5348726851851852 | 50.119 |
| 0.5348842592592592 | 50.118 |
| 0.5348958333333333 | 50.118 |
| 0.5349074074074074 | 50.116 |
| 0.5349189814814815 | 50.117 |
| 0.5349305555555556 | 50.117 |
| 0.5349421296296296 | 50.117 |
| 0.5349537037037037 | 50.118 |
| 0.5349652777777778 | 50.118 |
| 0.5349768518518518 | 50.117 |
| 0.534988425925926 | 50.116 |
| 0.535 | 50.117 |
| 0.5350115740740741 | 50.119 |
| 0.5350231481481481 | 50.119 |
| 0.5350347222222223 | 50.121 |
| 0.5350462962962963 | 50.124 |
| 0.5350578703703703 | 50.122 |
| 0.5350694444444445 | 50.123 |
| 0.5350810185185185 | 50.127 |
| 0.5350925925925926 | 50.126 |
| 0.5351041666666666 | 50.131 |
| 0.5351157407407408 | 50.13 |
| 0.5351273148148148 | 50.129 |
| 0.5351388888888889 | 50.127 |
| 0.535150462962963 | 50.126 |
| 0.535162037037037 | 50.126 |
| 0.5351736111111111 | 50.127 |
| 0.5351851851851852 | 50.128 |
| 0.5351967592592592 | 50.128 |
| 0.5352083333333334 | 50.13 |
| 0.5352199074074074 | 50.13 |
| 0.5352314814814815 | 50.136 |
| 0.5352430555555555 | 50.137 |
| 0.5352546296296297 | 50.137 |
| 0.5352662037037037 | 50.135 |
| 0.5352777777777777 | 50.134 |
| 0.5352893518518519 | 50.133 |
| 0.5353009259259259 | 50.13 |
| 0.5353125 | 50.127 |
| 0.535324074074074 | 50.123 |
| 0.5353356481481482 | 50.121 |
| 0.5353472222222222 | 50.123 |
| 0.5353587962962963 | 50.126 |
| 0.5353703703703704 | 50.124 |
| 0.5353819444444444 | 50.123 |
| 0.5353935185185185 | 50.124 |
| 0.5354050925925926 | 50.125 |
| 0.5354166666666667 | 50.125 |
| 0.5354282407407408 | 50.124 |
| 0.5354398148148148 | 50.123 |
| 0.5354513888888889 | 50.123 |
| 0.5354629629629629 | 50.122 |
| 0.5354745370370371 | 50.12 |
| 0.5354861111111111 | 50.119 |
| 0.5354976851851853 | 50.118 |
| 0.5355092592592593 | 50.12 |
| 0.5355208333333333 | 50.12 |
| 0.5355324074074074 | 50.122 |
| 0.5355439814814814 | 50.121 |
| 0.5355555555555556 | 50.119 |
| 0.5355671296296296 | 50.119 |
| 0.5355787037037038 | 50.121 |
| 0.5355902777777778 | 50.122 |
| 0.5356018518518518 | 50.123 |
| 0.5356134259259259 | 50.123 |
| 0.535625 | 50.123 |
| 0.5356365740740741 | 50.124 |
| 0.5356481481481482 | 50.125 |
| 0.5356597222222222 | 50.123 |
| 0.5356712962962963 | 50.122 |
| 0.5356828703703703 | 50.122 |
| 0.5356944444444445 | 50.122 |
| 0.5357060185185185 | 50.124 |
| 0.5357175925925927 | 50.125 |
| 0.5357291666666667 | 50.129 |
| 0.5357407407407407 | 50.133 |
| 0.5357523148148148 | 50.136 |
| 0.5357638888888888 | 50.136 |
| 0.535775462962963 | 50.135 |
| 0.535787037037037 | 50.133 |
| 0.5357986111111112 | 50.134 |
| 0.5358101851851852 | 50.135 |
| 0.5358217592592592 | 50.136 |
| 0.5358333333333333 | 50.138 |
| 0.5358449074074074 | 50.142 |
| 0.5358564814814815 | 50.143 |
| 0.5358680555555556 | 50.143 |
| 0.5358796296296297 | 50.142 |
| 0.5358912037037037 | 50.144 |
| 0.5359027777777777 | 50.148 |
| 0.5359143518518519 | 50.148 |
| 0.5359259259259259 | 50.147 |
| 0.5359375000000001 | 50.145 |
| 0.5359490740740741 | 50.141 |
| 0.5359606481481481 | 50.138 |
| 0.5359722222222222 | 50.137 |
| 0.5359837962962963 | 50.137 |
| 0.5359953703703704 | 50.134 |
| 0.5360069444444444 | 50.131 |
| 0.5360185185185186 | 50.131 |
| 0.5360300925925926 | 50.13 |
| 0.5360416666666666 | 50.13 |
| 0.5360532407407407 | 50.13 |
| 0.5360648148148148 | 50.131 |
| 0.5360763888888889 | 50.134 |
| 0.536087962962963 | 50.135 |
| 0.536099537037037 | 50.136 |
| 0.5361111111111111 | 50.136 |
| 0.5361226851851851 | 50.135 |
| 0.5361342592592593 | 50.129 |
| 0.5361458333333333 | 50.128 |
| 0.5361574074074075 | 50.129 |
| 0.5361689814814815 | 50.128 |
| 0.5361805555555555 | 50.128 |
| 0.5361921296296296 | 50.13 |
| 0.5362037037037037 | 50.134 |
| 0.5362152777777778 | 50.132 |
| 0.5362268518518518 | 50.133 |
| 0.536238425925926 | 50.134 |
| 0.53625 | 50.138 |
| 0.536261574074074 | 50.139 |
| 0.5362731481481481 | 50.139 |
| 0.5362847222222222 | 50.139 |
| 0.5362962962962963 | 50.14 |
| 0.5363078703703704 | 50.142 |
| 0.5363194444444445 | 50.144 |
| 0.5363310185185185 | 50.148 |
| 0.5363425925925925 | 50.15 |
| 0.5363541666666667 | 50.151 |
| 0.5363657407407407 | 50.153 |
| 0.5363773148148149 | 50.155 |
| 0.5363888888888889 | 50.154 |
| 0.536400462962963 | 50.153 |
| 0.536412037037037 | 50.15 |
| 0.5364236111111111 | 50.15 |
| 0.5364351851851852 | 50.149 |
| 0.5364467592592593 | 50.147 |
| 0.5364583333333334 | 50.146 |
| 0.5364699074074074 | 50.145 |
| 0.5364814814814814 | 50.145 |
| 0.5364930555555555 | 50.145 |
| 0.5365046296296296 | 50.144 |
| 0.5365162037037037 | 50.146 |
| 0.5365277777777778 | 50.147 |
| 0.5365393518518519 | 50.149 |
| 0.5365509259259259 | 50.148 |
| 0.5365624999999999 | 50.146 |
| 0.5365740740740741 | 50.146 |
| 0.5365856481481481 | 50.147 |
| 0.5365972222222223 | 50.147 |
| 0.5366087962962963 | 50.15 |
| 0.5366203703703704 | 50.152 |
| 0.5366319444444444 | 50.151 |
| 0.5366435185185185 | 50.149 |
| 0.5366550925925926 | 50.149 |
| 0.5366666666666667 | 50.149 |
| 0.5366782407407408 | 50.147 |
| 0.5366898148148148 | 50.145 |
| 0.5367013888888889 | 50.146 |
| 0.5367129629629629 | 50.147 |
| 0.536724537037037 | 50.15 |
| 0.5367361111111111 | 50.15 |
| 0.5367476851851852 | 50.149 |
| 0.5367592592592593 | 50.15 |
| 0.5367708333333333 | 50.152 |
| 0.5367824074074073 | 50.156 |
| 0.5367939814814815 | 50.156 |
| 0.5368055555555555 | 50.154 |
| 0.5368171296296297 | 50.154 |
| 0.5368287037037037 | 50.153 |
| 0.5368402777777778 | 50.153 |
| 0.5368518518518518 | 50.154 |
| 0.536863425925926 | 50.159 |
| 0.536875 | 50.165 |
| 0.5368865740740741 | 50.171 |
| 0.5368981481481482 | 50.174 |
| 0.5369097222222222 | 50.177 |
| 0.5369212962962963 | 50.175 |
| 0.5369328703703703 | 50.169 |
| 0.5369444444444444 | 50.164 |
| 0.5369560185185185 | 50.158 |
| 0.5369675925925926 | 50.148 |
| 0.5369791666666667 | 50.139 |
| 0.5369907407407407 | 50.129 |
| 0.5370023148148148 | 50.119 |
| 0.5370138888888889 | 50.119 |
| 0.5370254629629629 | 50.118 |
| 0.5370370370370371 | 50.128 |
| 0.5370486111111111 | 50.139 |
| 0.5370601851851852 | 50.151 |
| 0.5370717592592592 | 50.158 |
| 0.5370833333333334 | 50.16 |
| 0.5370949074074074 | 50.159 |
| 0.5371064814814815 | 50.158 |
| 0.5371180555555556 | 50.153 |
| 0.5371296296296296 | 50.149 |
| 0.5371412037037037 | 50.143 |
| 0.5371527777777778 | 50.142 |
| 0.5371643518518519 | 50.139 |
| 0.5371759259259259 | 50.138 |
| 0.5371875 | 50.139 |
| 0.5371990740740741 | 50.14 |
| 0.5372106481481481 | 50.143 |
| 0.5372222222222222 | 50.145 |
| 0.5372337962962963 | 50.152 |
| 0.5372453703703703 | 50.153 |
| 0.5372569444444445 | 50.156 |
| 0.5372685185185185 | 50.155 |
| 0.5372800925925926 | 50.157 |
| 0.5372916666666666 | 50.162 |
| 0.5373032407407408 | 50.162 |
| 0.5373148148148148 | 50.164 |
| 0.537326388888889 | 50.167 |
| 0.537337962962963 | 50.171 |
| 0.537349537037037 | 50.176 |
| 0.5373611111111111 | 50.18 |
| 0.5373726851851852 | 50.185 |
| 0.5373842592592593 | 50.186 |
| 0.5373958333333334 | 50.188 |
| 0.5374074074074074 | 50.19 |
| 0.5374189814814815 | 50.187 |
| 0.5374305555555555 | 50.187 |
| 0.5374421296296296 | 50.188 |
| 0.5374537037037037 | 50.19 |
| 0.5374652777777778 | 50.19 |
| 0.5374768518518519 | 50.19 |
| 0.5374884259259259 | 50.189 |
| 0.5375 | 50.188 |
| 0.537511574074074 | 50.187 |
| 0.5375231481481482 | 50.184 |
| 0.5375347222222222 | 50.179 |
| 0.5375462962962964 | 50.177 |
| 0.5375578703703704 | 50.173 |
| 0.5375694444444444 | 50.171 |
| 0.5375810185185185 | 50.166 |
| 0.5375925925925926 | 50.162 |
| 0.5376041666666667 | 50.162 |
| 0.5376157407407408 | 50.157 |
| 0.5376273148148148 | 50.153 |
| 0.5376388888888889 | 50.152 |
| 0.5376504629629629 | 50.151 |
| 0.537662037037037 | 50.149 |
| 0.5376736111111111 | 50.151 |
| 0.5376851851851852 | 50.153 |
| 0.5376967592592593 | 50.158 |
| 0.5377083333333333 | 50.162 |
| 0.5377199074074074 | 50.166 |
| 0.5377314814814814 | 50.17 |
| 0.5377430555555556 | 50.171 |
| 0.5377546296296296 | 50.17 |
| 0.5377662037037038 | 50.169 |
| 0.5377777777777778 | 50.168 |
| 0.5377893518518518 | 50.167 |
| 0.5378009259259259 | 50.164 |
| 0.5378125 | 50.164 |
| 0.5378240740740741 | 50.163 |
| 0.5378356481481482 | 50.162 |
| 0.5378472222222223 | 50.161 |
| 0.5378587962962963 | 50.157 |
| 0.5378703703703703 | 50.158 |
| 0.5378819444444444 | 50.155 |
| 0.5378935185185185 | 50.154 |
| 0.5379050925925926 | 50.15 |
| 0.5379166666666667 | 50.151 |
| 0.5379282407407407 | 50.15 |
| 0.5379398148148148 | 50.149 |
| 0.5379513888888888 | 50.149 |
| 0.537962962962963 | 50.145 |
| 0.537974537037037 | 50.141 |
| 0.5379861111111112 | 50.137 |
| 0.5379976851851852 | 50.137 |
| 0.5380092592592592 | 50.135 |
| 0.5380208333333333 | 50.133 |
| 0.5380324074074074 | 50.132 |
| 0.5380439814814815 | 50.135 |
| 0.5380555555555556 | 50.14 |
| 0.5380671296296297 | 50.14 |
| 0.5380787037037037 | 50.139 |
| 0.5380902777777777 | 50.137 |
| 0.5381018518518519 | 50.134 |
| 0.5381134259259259 | 50.132 |
| 0.538125 | 50.13 |
| 0.5381365740740741 | 50.131 |
| 0.5381481481481482 | 50.129 |
| 0.5381597222222222 | 50.132 |
| 0.5381712962962962 | 50.135 |
| 0.5381828703703704 | 50.14 |
| 0.5381944444444444 | 50.145 |
| 0.5382060185185186 | 50.146 |
| 0.5382175925925926 | 50.151 |
| 0.5382291666666666 | 50.157 |
| 0.5382407407407407 | 50.157 |
| 0.5382523148148148 | 50.157 |
| 0.5382638888888889 | 50.158 |
| 0.538275462962963 | 50.157 |
| 0.5382870370370371 | 50.156 |
| 0.5382986111111111 | 50.155 |
| 0.5383101851851851 | 50.156 |
| 0.5383217592592593 | 50.155 |
| 0.5383333333333333 | 50.15 |
| 0.5383449074074075 | 50.146 |
| 0.5383564814814815 | 50.146 |
| 0.5383680555555556 | 50.142 |
| 0.5383796296296296 | 50.138 |
| 0.5383912037037036 | 50.134 |
| 0.5384027777777778 | 50.132 |
| 0.5384143518518518 | 50.132 |
| 0.538425925925926 | 50.133 |
| 0.5384375 | 50.135 |
| 0.538449074074074 | 50.136 |
| 0.5384606481481481 | 50.138 |
| 0.5384722222222222 | 50.138 |
| 0.5384837962962963 | 50.14 |
| 0.5384953703703704 | 50.142 |
| 0.5385069444444445 | 50.142 |
| 0.5385185185185185 | 50.142 |
| 0.5385300925925925 | 50.143 |
| 0.5385416666666667 | 50.14 |
| 0.5385532407407407 | 50.14 |
| 0.5385648148148149 | 50.139 |
| 0.5385763888888889 | 50.139 |
| 0.538587962962963 | 50.136 |
| 0.538599537037037 | 50.134 |
| 0.538611111111111 | 50.134 |
| 0.5386226851851852 | 50.134 |
| 0.5386342592592592 | 50.132 |
| 0.5386458333333334 | 50.131 |
| 0.5386574074074074 | 50.13 |
| 0.5386689814814815 | 50.128 |
| 0.5386805555555555 | 50.126 |
| 0.5386921296296296 | 50.122 |
| 0.5387037037037037 | 50.119 |
| 0.5387152777777778 | 50.118 |
| 0.5387268518518519 | 50.115 |
| 0.5387384259259259 | 50.112 |
| 0.53875 | 50.112 |
| 0.5387615740740741 | 50.112 |
| 0.5387731481481481 | 50.111 |
| 0.5387847222222223 | 50.114 |
| 0.5387962962962963 | 50.115 |
| 0.5388078703703704 | 50.12 |
| 0.5388194444444444 | 50.124 |
| 0.5388310185185184 | 50.125 |
| 0.5388425925925926 | 50.129 |
| 0.5388541666666666 | 50.131 |
| 0.5388657407407408 | 50.131 |
| 0.5388773148148148 | 50.13 |
| 0.5388888888888889 | 50.128 |
| 0.5389004629629629 | 50.121 |
| 0.538912037037037 | 50.118 |
| 0.5389236111111111 | 50.115 |
| 0.5389351851851852 | 50.11 |
| 0.5389467592592593 | 50.108 |
| 0.5389583333333333 | 50.103 |
| 0.5389699074074074 | 50.101 |
| 0.5389814814814815 | 50.1 |
| 0.5389930555555555 | 50.093 |
| 0.5390046296296297 | 50.089 |
| 0.5390162037037037 | 50.085 |
| 0.5390277777777778 | 50.083 |
| 0.5390393518518518 | 50.081 |
| 0.539050925925926 | 50.081 |
| 0.5390625 | 50.081 |
| 0.539074074074074 | 50.08 |
| 0.5390856481481482 | 50.08 |
| 0.5390972222222222 | 50.08 |
| 0.5391087962962963 | 50.079 |
| 0.5391203703703703 | 50.079 |
| 0.5391319444444445 | 50.078 |
| 0.5391435185185185 | 50.078 |
| 0.5391550925925926 | 50.077 |
| 0.5391666666666667 | 50.075 |
| 0.5391782407407407 | 50.072 |
| 0.5391898148148148 | 50.071 |
| 0.5392013888888889 | 50.069 |
| 0.539212962962963 | 50.069 |
| 0.5392245370370371 | 50.069 |
| 0.5392361111111111 | 50.069 |
| 0.5392476851851852 | 50.073 |
| 0.5392592592592592 | 50.079 |
| 0.5392708333333334 | 50.084 |
| 0.5392824074074074 | 50.088 |
| 0.5392939814814816 | 50.092 |
| 0.5393055555555556 | 50.094 |
| 0.5393171296296296 | 50.094 |
| 0.5393287037037037 | 50.092 |
| 0.5393402777777777 | 50.093 |
| 0.5393518518518519 | 50.088 |
| 0.5393634259259259 | 50.084 |
| 0.539375 | 50.08 |
| 0.5393865740740741 | 50.082 |
| 0.5393981481481481 | 50.079 |
| 0.5394097222222222 | 50.075 |
| 0.5394212962962963 | 50.075 |
| 0.5394328703703704 | 50.074 |
| 0.5394444444444445 | 50.073 |
| 0.5394560185185185 | 50.071 |
| 0.5394675925925926 | 50.069 |
| 0.5394791666666666 | 50.068 |
| 0.5394907407407408 | 50.067 |
| 0.5395023148148148 | 50.066 |
| 0.539513888888889 | 50.067 |
| 0.539525462962963 | 50.067 |
| 0.539537037037037 | 50.069 |
| 0.5395486111111111 | 50.07 |
| 0.5395601851851851 | 50.071 |
| 0.5395717592592593 | 50.071 |
| 0.5395833333333333 | 50.071 |
| 0.5395949074074075 | 50.068 |
| 0.5396064814814815 | 50.064 |
| 0.5396180555555555 | 50.062 |
| 0.5396296296296296 | 50.058 |
| 0.5396412037037037 | 50.056 |
| 0.5396527777777778 | 50.052 |
| 0.5396643518518519 | 50.047 |
| 0.539675925925926 | 50.047 |
| 0.5396875 | 50.042 |
| 0.539699074074074 | 50.04 |
| 0.5397106481481482 | 50.039 |
| 0.5397222222222222 | 50.04 |
| 0.5397337962962964 | 50.044 |
| 0.5397453703703704 | 50.051 |
| 0.5397569444444444 | 50.057 |
| 0.5397685185185185 | 50.063 |
| 0.5397800925925925 | 50.068 |
| 0.5397916666666667 | 50.069 |
| 0.5398032407407407 | 50.069 |
| 0.5398148148148149 | 50.068 |
| 0.5398263888888889 | 50.067 |
| 0.5398379629629629 | 50.067 |
| 0.539849537037037 | 50.064 |
| 0.5398611111111111 | 50.06 |
| 0.5398726851851852 | 50.057 |
| 0.5398842592592593 | 50.054 |
| 0.5398958333333334 | 50.053 |
| 0.5399074074074074 | 50.053 |
| 0.5399189814814814 | 50.052 |
| 0.5399305555555556 | 50.053 |
| 0.5399421296296296 | 50.053 |
| 0.5399537037037038 | 50.052 |
| 0.5399652777777778 | 50.05 |
| 0.5399768518518518 | 50.05 |
| 0.5399884259259259 | 50.049 |
| 0.54 | 50.049 |
| 0.5400115740740741 | 50.051 |
| 0.5400231481481481 | 50.05 |
| 0.5400347222222223 | 50.047 |
| 0.5400462962962963 | 50.046 |
| 0.5400578703703703 | 50.046 |
| 0.5400694444444444 | 50.046 |
| 0.5400810185185185 | 50.047 |
| 0.5400925925925926 | 50.046 |
| 0.5401041666666667 | 50.046 |
| 0.5401157407407408 | 50.045 |
| 0.5401273148148148 | 50.045 |
| 0.5401388888888888 | 50.045 |
| 0.540150462962963 | 50.047 |
| 0.540162037037037 | 50.047 |
| 0.5401736111111112 | 50.044 |
| 0.5401851851851852 | 50.043 |
| 0.5401967592592593 | 50.041 |
| 0.5402083333333333 | 50.039 |
| 0.5402199074074074 | 50.04 |
| 0.5402314814814815 | 50.041 |
| 0.5402430555555556 | 50.043 |
| 0.5402546296296297 | 50.044 |
| 0.5402662037037037 | 50.045 |
| 0.5402777777777777 | 50.047 |
| 0.5402893518518518 | 50.045 |
| 0.5403009259259259 | 50.045 |
| 0.5403125 | 50.043 |
| 0.5403240740740741 | 50.045 |
| 0.5403356481481482 | 50.046 |
| 0.5403472222222222 | 50.045 |
| 0.5403587962962962 | 50.044 |
| 0.5403703703703704 | 50.045 |
| 0.5403819444444444 | 50.043 |
| 0.5403935185185186 | 50.042 |
| 0.5404050925925926 | 50.038 |
| 0.5404166666666667 | 50.037 |
| 0.5404282407407407 | 50.033 |
| 0.5404398148148148 | 50.032 |
| 0.5404513888888889 | 50.03 |
| 0.540462962962963 | 50.029 |
| 0.5404745370370371 | 50.029 |
| 0.5404861111111111 | 50.027 |
| 0.5404976851851852 | 50.027 |
| 0.5405092592592592 | 50.031 |
| 0.5405208333333333 | 50.03 |
| 0.5405324074074074 | 50.031 |
| 0.5405439814814815 | 50.029 |
| 0.5405555555555556 | 50.03 |
| 0.5405671296296296 | 50.032 |
| 0.5405787037037036 | 50.028 |
| 0.5405902777777778 | 50.029 |
| 0.5406018518518518 | 50.031 |
| 0.540613425925926 | 50.032 |
| 0.540625 | 50.034 |
| 0.5406365740740741 | 50.035 |
| 0.5406481481481481 | 50.034 |
| 0.5406597222222222 | 50.034 |
| 0.5406712962962963 | 50.03 |
| 0.5406828703703704 | 50.03 |
| 0.5406944444444445 | 50.029 |
| 0.5407060185185185 | 50.028 |
| 0.5407175925925926 | 50.026 |
| 0.5407291666666666 | 50.023 |
| 0.5407407407407407 | 50.021 |
| 0.5407523148148148 | 50.022 |
| 0.5407638888888889 | 50.021 |
| 0.540775462962963 | 50.023 |
| 0.540787037037037 | 50.021 |
| 0.540798611111111 | 50.021 |
| 0.5408101851851852 | 50.021 |
| 0.5408217592592592 | 50.021 |
| 0.5408333333333334 | 50.022 |
| 0.5408449074074074 | 50.024 |
| 0.5408564814814815 | 50.024 |
| 0.5408680555555555 | 50.027 |
| 0.5408796296296297 | 50.027 |
| 0.5408912037037037 | 50.025 |
| 0.5409027777777778 | 50.025 |
| 0.5409143518518519 | 50.024 |
| 0.5409259259259259 | 50.023 |
| 0.5409375 | 50.022 |
| 0.5409490740740741 | 50.02 |
| 0.5409606481481481 | 50.021 |
| 0.5409722222222222 | 50.019 |
| 0.5409837962962963 | 50.013 |
| 0.5409953703703704 | 50.014 |
| 0.5410069444444444 | 50.013 |
| 0.5410185185185185 | 50.011 |
| 0.5410300925925926 | 50.012 |
| 0.5410416666666666 | 50.013 |
| 0.5410532407407408 | 50.015 |
| 0.5410648148148148 | 50.015 |
| 0.5410763888888889 | 50.015 |
| 0.5410879629629629 | 50.014 |
| 0.5410995370370371 | 50.015 |
| 0.5411111111111111 | 50.017 |
| 0.5411226851851852 | 50.02 |
| 0.5411342592592593 | 50.024 |
| 0.5411458333333333 | 50.026 |
| 0.5411574074074074 | 50.027 |
| 0.5411689814814815 | 50.027 |
| 0.5411805555555556 | 50.03 |
| 0.5411921296296297 | 50.03 |
| 0.5412037037037037 | 50.03 |
| 0.5412152777777778 | 50.03 |
| 0.5412268518518518 | 50.032 |
| 0.5412384259259259 | 50.031 |
| 0.54125 | 50.032 |
| 0.541261574074074 | 50.034 |
| 0.5412731481481482 | 50.037 |
| 0.5412847222222222 | 50.037 |
| 0.5412962962962963 | 50.037 |
| 0.5413078703703703 | 50.035 |
| 0.5413194444444445 | 50.035 |
| 0.5413310185185185 | 50.033 |
| 0.5413425925925927 | 50.032 |
| 0.5413541666666667 | 50.033 |
| 0.5413657407407407 | 50.035 |
| 0.5413773148148148 | 50.036 |
| 0.5413888888888889 | 50.037 |
| 0.541400462962963 | 50.04 |
| 0.5414120370370371 | 50.043 |
| 0.5414236111111111 | 50.045 |
| 0.5414351851851852 | 50.045 |
| 0.5414467592592592 | 50.046 |
| 0.5414583333333333 | 50.045 |
| 0.5414699074074074 | 50.045 |
| 0.5414814814814815 | 50.045 |
| 0.5414930555555556 | 50.048 |
| 0.5415046296296296 | 50.047 |
| 0.5415162037037037 | 50.043 |
| 0.5415277777777777 | 50.043 |
| 0.5415393518518519 | 50.044 |
| 0.5415509259259259 | 50.043 |
| 0.5415625000000001 | 50.043 |
| 0.5415740740740741 | 50.043 |
| 0.5415856481481481 | 50.042 |
| 0.5415972222222222 | 50.04 |
| 0.5416087962962963 | 50.041 |
| 0.5416203703703704 | 50.042 |
| 0.5416319444444445 | 50.042 |
| 0.5416435185185186 | 50.041 |
| 0.5416550925925926 | 50.039 |
| 0.5416666666666666 | 50.038 |